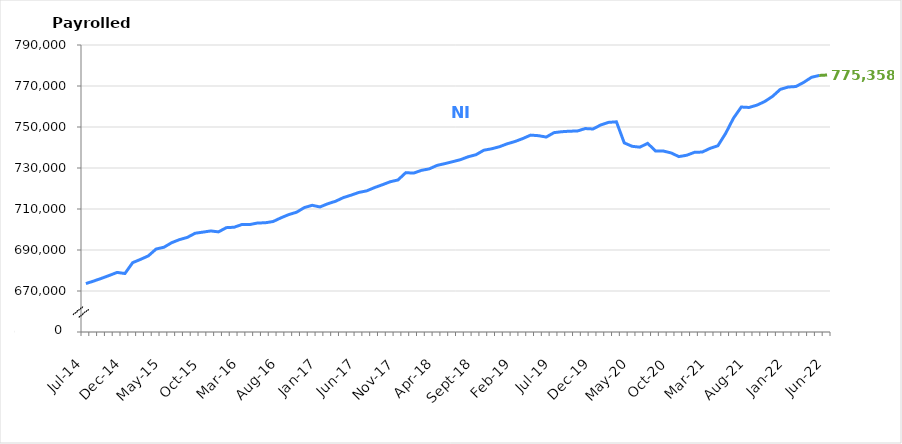
| Category | NI |
|---|---|
| Jul-14 | 673618 |
| Aug-14 | 674857 |
| Sep-14 | 676179 |
| Oct-14 | 677589 |
| Nov-14 | 679066 |
| Dec-14 | 678518 |
| Jan-15 | 683842 |
| Feb-15 | 685416 |
| Mar-15 | 687127 |
| Apr-15 | 690483 |
| May-15 | 691340 |
| Jun-15 | 693574 |
| Jul-15 | 695069 |
| Aug-15 | 696146 |
| Sep-15 | 698170 |
| Oct-15 | 698717 |
| Nov-15 | 699297 |
| Dec-15 | 698845 |
| Jan-16 | 700900 |
| Feb-16 | 701108 |
| Mar-16 | 702437 |
| Apr-16 | 702404 |
| May-16 | 703170 |
| Jun-16 | 703282 |
| Jul-16 | 703904 |
| Aug-16 | 705687 |
| Sep-16 | 707271 |
| Oct-16 | 708431 |
| Nov-16 | 710698 |
| Dec-16 | 711806 |
| Jan-17 | 711002 |
| Feb-17 | 712561 |
| Mar-17 | 713774 |
| Apr-17 | 715558 |
| May-17 | 716766 |
| Jun-17 | 718100 |
| Jul-17 | 718857 |
| Aug-17 | 720454 |
| Sep-17 | 721829 |
| Oct-17 | 723290 |
| Nov-17 | 724162 |
| Dec-17 | 727733 |
| Jan-18 | 727502 |
| Feb-18 | 728845 |
| Mar-18 | 729571 |
| Apr-18 | 731262 |
| May-18 | 732129 |
| Jun-18 | 733072 |
| Jul-18 | 734052 |
| Aug-18 | 735486 |
| Sep-18 | 736486 |
| Oct-18 | 738669 |
| Nov-18 | 739369 |
| Dec-18 | 740373 |
| Jan-19 | 741812 |
| Feb-19 | 742928 |
| Mar-19 | 744366 |
| Apr-19 | 746042 |
| May-19 | 745763 |
| Jun-19 | 745092 |
| Jul-19 | 747250 |
| Aug-19 | 747701 |
| Sep-19 | 747955 |
| Oct-19 | 748046 |
| Nov-19 | 749243 |
| Dec-19 | 749032 |
| Jan-20 | 751026 |
| Feb-20 | 752259 |
| Mar-20 | 752528 |
| Apr-20 | 742257 |
| May-20 | 740589 |
| Jun-20 | 740163 |
| Jul-20 | 742017 |
| Aug-20 | 738335 |
| Sep-20 | 738288 |
| Oct-20 | 737363 |
| Nov-20 | 735560 |
| Dec-20 | 736218 |
| Jan-21 | 737645 |
| Feb-21 | 737785 |
| Mar-21 | 739575 |
| Apr-21 | 740833 |
| May-21 | 746912 |
| Jun-21 | 754298 |
| Jul-21 | 759737 |
| Aug-21 | 759534 |
| Sep-21 | 760655 |
| Oct-21 | 762419 |
| Nov-21 | 764922 |
| Dec-21 | 768359 |
| Jan-22 | 769494 |
| Feb-22 | 769744 |
| Mar-22 | 771761 |
| Apr-22 | 774245 |
| May-22 | 775149 |
| Jun-22 | 775358 |